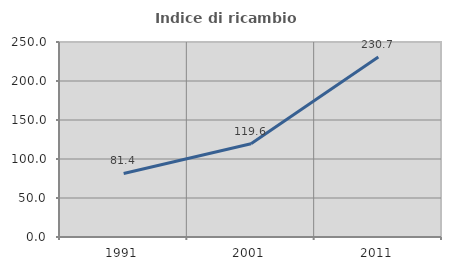
| Category | Indice di ricambio occupazionale  |
|---|---|
| 1991.0 | 81.439 |
| 2001.0 | 119.608 |
| 2011.0 | 230.714 |